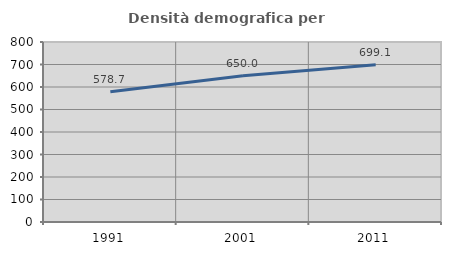
| Category | Densità demografica |
|---|---|
| 1991.0 | 578.653 |
| 2001.0 | 650.02 |
| 2011.0 | 699.06 |